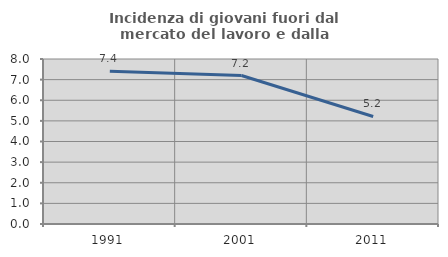
| Category | Incidenza di giovani fuori dal mercato del lavoro e dalla formazione  |
|---|---|
| 1991.0 | 7.409 |
| 2001.0 | 7.199 |
| 2011.0 | 5.213 |